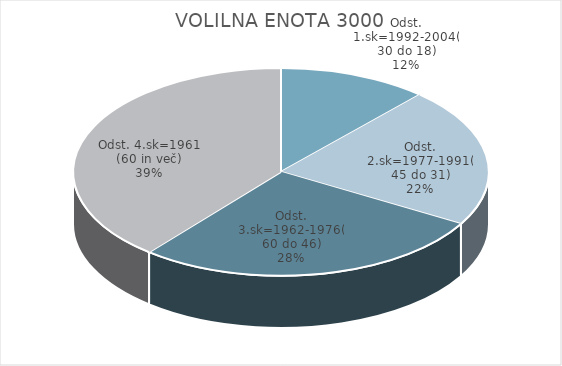
| Category | VOLILNA ENOTA 3000 |
|---|---|
| Odst. 1.sk=1992-2004(30 do 18) | 6.41 |
| Odst. 2.sk=1977-1991(45 do 31) | 11.97 |
| Odst. 3.sk=1962-1976(60 do 46) | 15.18 |
| Odst. 4.sk=1961 (60 in več) | 21.52 |